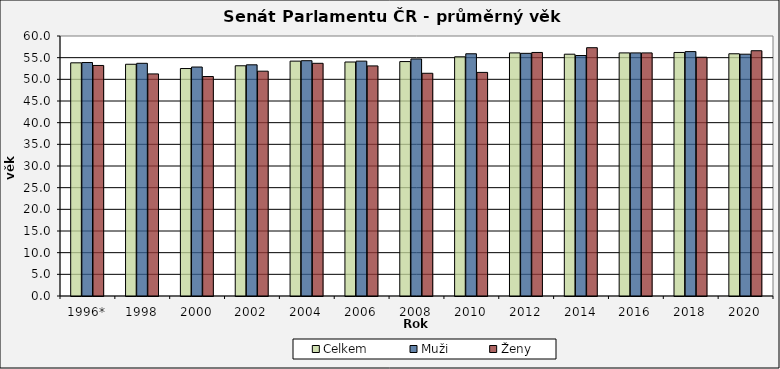
| Category | Celkem | Muži | Ženy |
|---|---|---|---|
| 1996* | 53.81 | 53.88 | 53.2 |
| 1998 | 53.48 | 53.7 | 51.25 |
| 2000 | 52.49 | 52.84 | 50.65 |
| 2002 | 53.13 | 53.35 | 51.88 |
| 2004 | 54.2 | 54.3 | 53.7 |
| 2006 | 54 | 54.2 | 53.1 |
| 2008 | 54.1 | 54.7 | 51.4 |
| 2010 | 55.2 | 55.9 | 51.6 |
| 2012 | 56.1 | 56 | 56.2 |
| 2014 | 55.8 | 55.5 | 57.3 |
| 2016 | 56.1 | 56.1 | 56.1 |
| 2018 | 56.2 | 56.4 | 55.1 |
| 2020 | 55.9 | 55.8 | 56.6 |